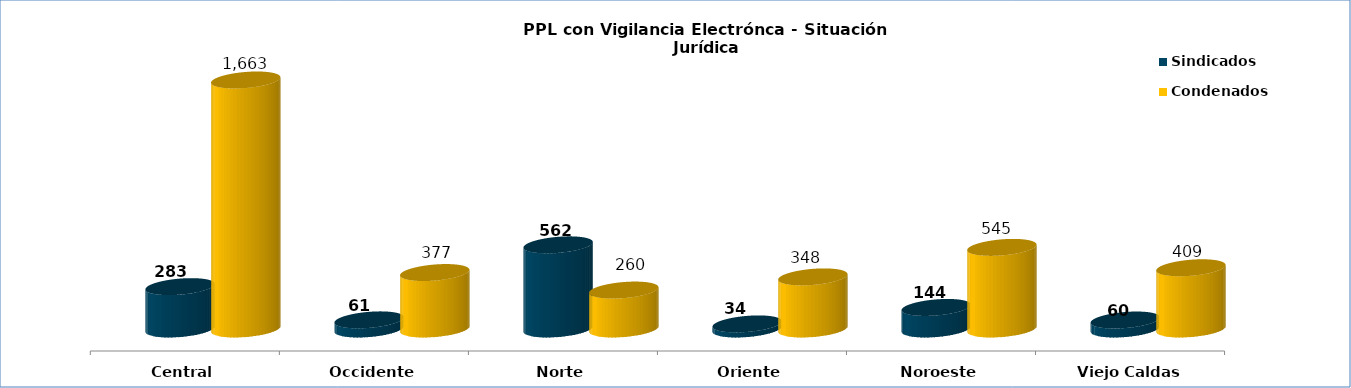
| Category | Sindicados | Condenados |
|---|---|---|
| Central | 283 | 1663 |
| Occidente | 61 | 377 |
| Norte | 562 | 260 |
| Oriente | 34 | 348 |
| Noroeste | 144 | 545 |
| Viejo Caldas | 60 | 409 |